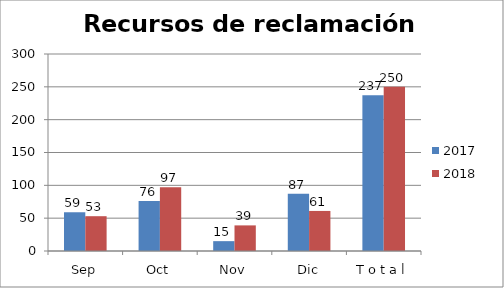
| Category | 2017 | 2018 |
|---|---|---|
| Sep | 59 | 53 |
| Oct | 76 | 97 |
| Nov | 15 | 39 |
| Dic | 87 | 61 |
| T o t a l | 237 | 250 |